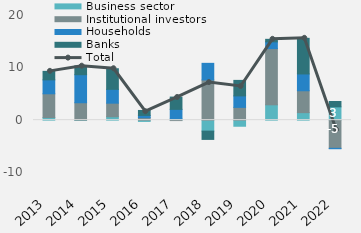
| Category | Business sector | Institutional investors | Households | Banks |
|---|---|---|---|---|
| 2013 | 501.207 | 4538.498 | 2661.819 | 1623.823 |
| 2014 | -63.975 | 3329.657 | 5356.57 | 1689.324 |
| 2015 | 659.06 | 2588.14 | 2643.585 | 3935.124 |
| 2016 | -238.698 | 476.343 | 427.167 | 949.824 |
| 2017 | 240.798 | -80.117 | 1824.021 | 2347.767 |
| 2018 | -2094.607 | 7681.841 | 3176.694 | -1582.31 |
| 2019 | -1161.569 | 2442.763 | 2192.252 | 2965.848 |
| 2020 | 2936.22 | 10742.268 | 1283.747 | 484.501 |
| 2021 | 1438.718 | 4178.212 | 3212.266 | 6807.148 |
| 2022 | 2549 | -5380 | -76 | 1023 |